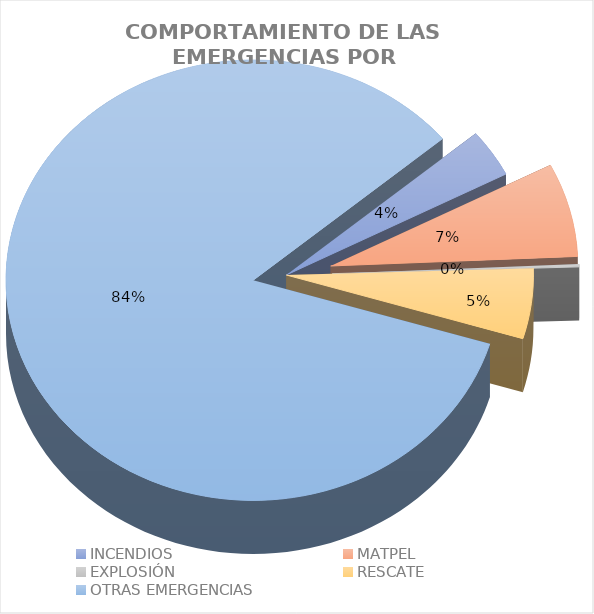
| Category | Incidentes |
|---|---|
| INCENDIOS | 0.035 |
| MATPEL | 0.069 |
| EXPLOSIÓN | 0.002 |
| RESCATE | 0.052 |
| OTRAS EMERGENCIAS | 0.842 |